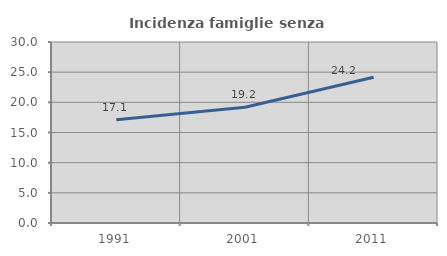
| Category | Incidenza famiglie senza nuclei |
|---|---|
| 1991.0 | 17.095 |
| 2001.0 | 19.175 |
| 2011.0 | 24.171 |